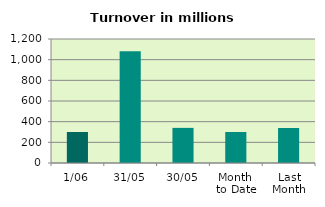
| Category | Series 0 |
|---|---|
| 1/06 | 299.926 |
| 31/05 | 1080.623 |
| 30/05 | 339.947 |
| Month 
to Date | 299.926 |
| Last
Month | 338.969 |